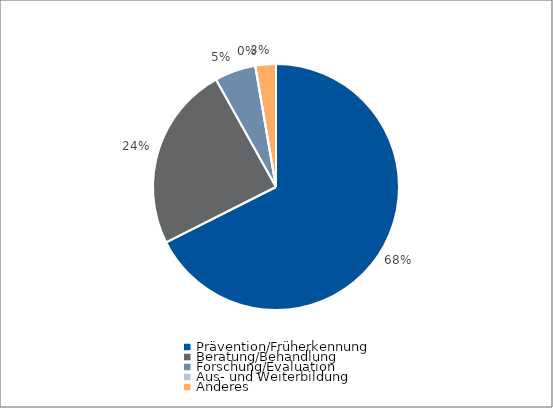
| Category | Series 0 |
|---|---|
| Prävention/Früherkennung | 25000 |
| Beratung/Behandlung | 9000 |
| Forschung/Evaluation | 2000 |
| Aus- und Weiterbildung | 0 |
| Anderes | 1000 |